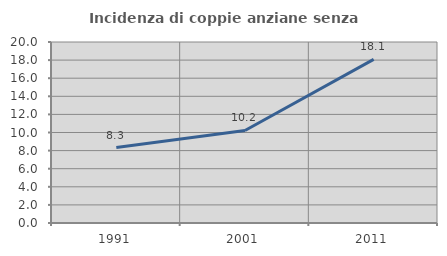
| Category | Incidenza di coppie anziane senza figli  |
|---|---|
| 1991.0 | 8.333 |
| 2001.0 | 10.227 |
| 2011.0 | 18.085 |